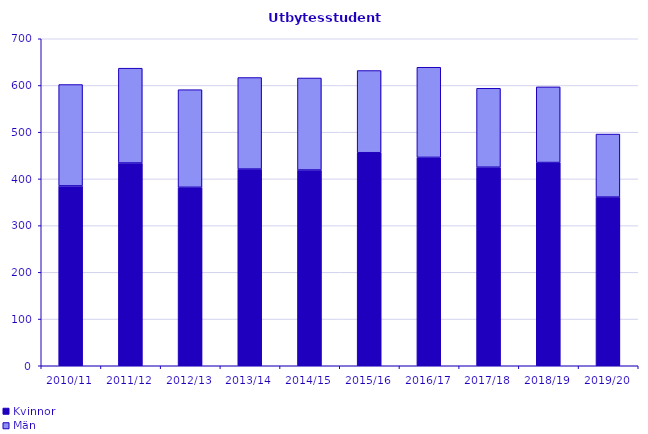
| Category | Kvinnor | Män |
|---|---|---|
| 2010/11 | 385 | 217 |
| 2011/12 | 434 | 203 |
| 2012/13 | 382 | 209 |
| 2013/14 | 421 | 196 |
| 2014/15 | 419 | 197 |
| 2015/16 | 456 | 176 |
| 2016/17 | 446 | 193 |
| 2017/18 | 425 | 169 |
| 2018/19 | 435 | 162 |
| 2019/20 | 361 | 135 |